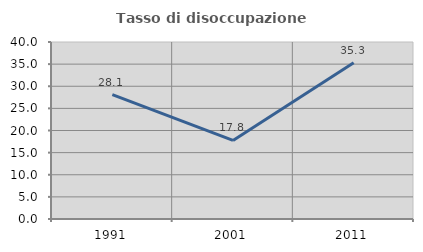
| Category | Tasso di disoccupazione giovanile  |
|---|---|
| 1991.0 | 28.125 |
| 2001.0 | 17.754 |
| 2011.0 | 35.323 |